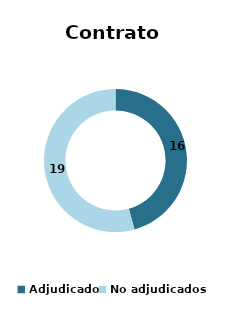
| Category | Series 0 |
|---|---|
| Adjudicados | 16 |
| No adjudicados | 19 |